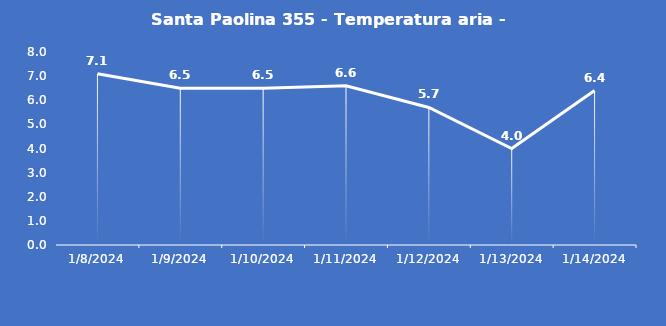
| Category | Santa Paolina 355 - Temperatura aria - Grezzo (°C) |
|---|---|
| 1/8/24 | 7.1 |
| 1/9/24 | 6.5 |
| 1/10/24 | 6.5 |
| 1/11/24 | 6.6 |
| 1/12/24 | 5.7 |
| 1/13/24 | 4 |
| 1/14/24 | 6.4 |